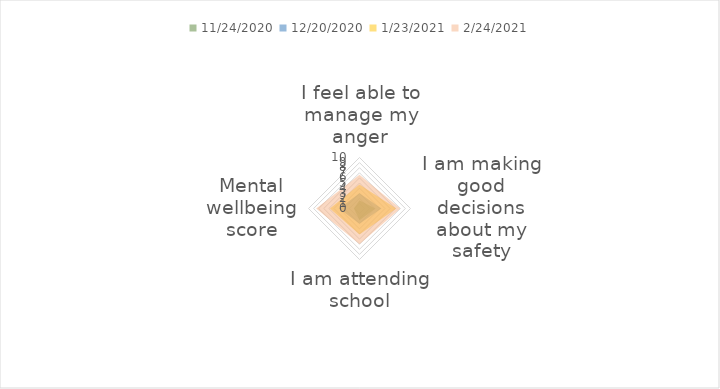
| Category | 11/24/2020 | 12/20/2020 | 1/23/2021 | 2/24/2021 |
|---|---|---|---|---|
| I feel able to manage my anger | 1.6 | 3 | 4.7 | 6.6 |
| I am making good decisions about my safety | 3.1 | 4.3 | 7.2 | 8 |
| I am attending school | 2.3 | 3 | 5.1 | 7 |
| Mental wellbeing score | 1.1 | 4 | 5.8 | 8.5 |